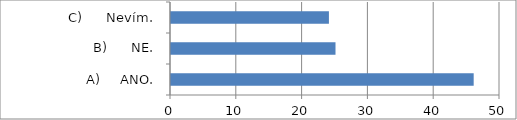
| Category | Series 0 |
|---|---|
| A)     ANO. | 46 |
| B)      NE. | 25 |
| C)      Nevím. | 24 |